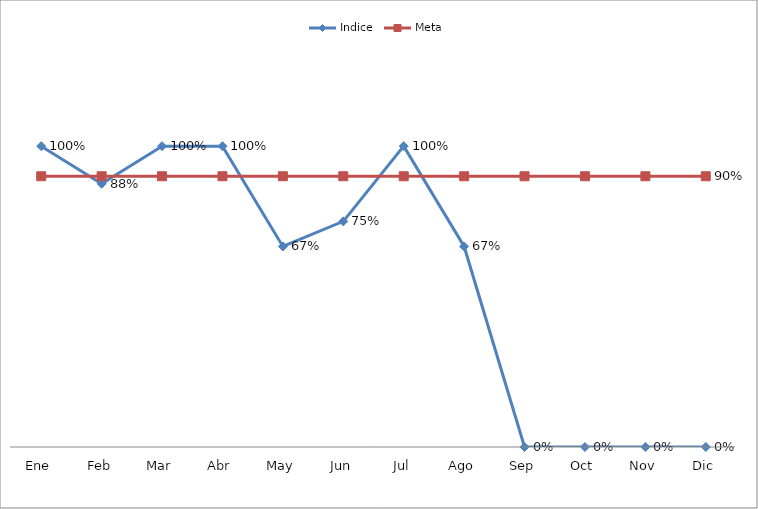
| Category | Indice | Meta |
|---|---|---|
| Ene | 1 | 0.9 |
| Feb | 0.875 | 0.9 |
| Mar | 1 | 0.9 |
| Abr | 1 | 0.9 |
| May | 0.667 | 0.9 |
| Jun | 0.75 | 0.9 |
| Jul | 1 | 0.9 |
| Ago | 0.667 | 0.9 |
| Sep | 0 | 0.9 |
| Oct | 0 | 0.9 |
| Nov | 0 | 0.9 |
| Dic | 0 | 0.9 |